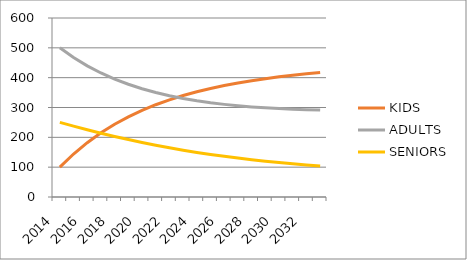
| Category | KIDS | ADULTS | SENIORS |
|---|---|---|---|
| 2014.0 | 100 | 500 | 250 |
| 2015.0 | 144 | 467.5 | 237.5 |
| 2016.0 | 182.11 | 439.637 | 225.438 |
| 2017.0 | 215.147 | 415.77 | 213.885 |
| 2018.0 | 243.815 | 395.345 | 202.89 |
| 2019.0 | 268.721 | 377.885 | 192.485 |
| 2020.0 | 290.386 | 362.979 | 182.684 |
| 2021.0 | 309.261 | 350.275 | 173.49 |
| 2022.0 | 325.733 | 339.468 | 164.898 |
| 2023.0 | 340.136 | 330.294 | 156.895 |
| 2024.0 | 352.757 | 322.529 | 149.462 |
| 2025.0 | 363.844 | 315.977 | 142.579 |
| 2026.0 | 373.611 | 310.471 | 136.221 |
| 2027.0 | 382.242 | 305.866 | 130.361 |
| 2028.0 | 389.894 | 302.038 | 124.971 |
| 2029.0 | 396.704 | 298.88 | 120.025 |
| 2030.0 | 402.79 | 296.299 | 115.495 |
| 2031.0 | 408.252 | 294.216 | 111.353 |
| 2032.0 | 413.179 | 292.563 | 107.573 |
| 2033.0 | 417.644 | 291.28 | 104.13 |